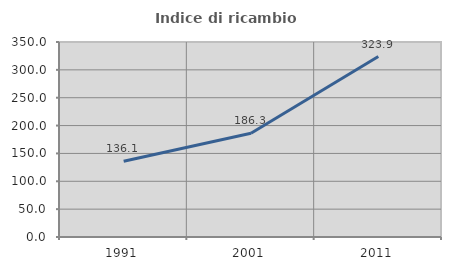
| Category | Indice di ricambio occupazionale  |
|---|---|
| 1991.0 | 136.078 |
| 2001.0 | 186.256 |
| 2011.0 | 323.926 |